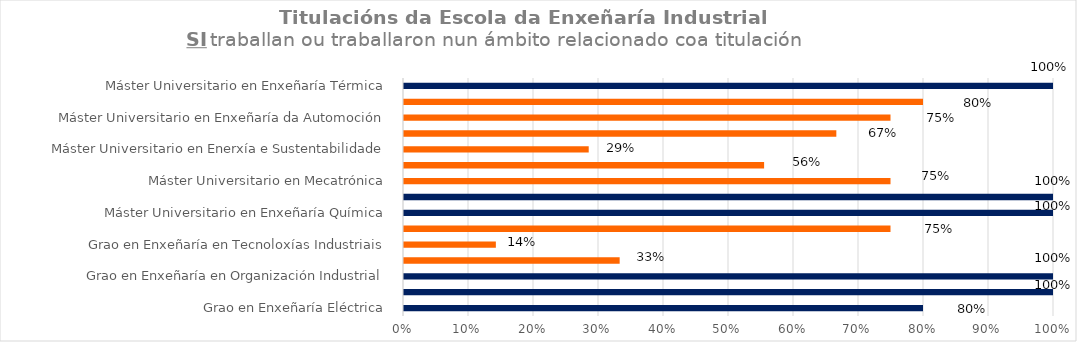
| Category | Series 1 |
|---|---|
| Grao en Enxeñaría Eléctrica | 0.8 |
| Grao en Enxeñaría en Electrónica Industrial e Automática | 1 |
| Grao en Enxeñaría en Organización Industrial | 1 |
| Grao en Enxeñaría en Química Industrial | 0.333 |
| Grao en Enxeñaría en Tecnoloxías Industriais | 0.143 |
| Grao en Enxeñaría Mecánica | 0.75 |
| Máster Universitario en Enxeñaría Química | 1 |
| Máster Universitario en Contaminación Industrial: Avaliación, Prevención e Control | 1 |
| Máster Universitario en Mecatrónica | 0.75 |
| Máster Universitario en Prevención de Riscos Laborais | 0.556 |
| Máster Universitario en Enerxía e Sustentabilidade | 0.286 |
| Máster Universitario en Enxeñaría da Construción | 0.667 |
| Máster Universitario en Enxeñaría da Automoción | 0.75 |
| Máster Universitario en Procesos de Deseño e Fabricación Mecánica | 0.8 |
| Máster Universitario en Enxeñaría Térmica | 1 |